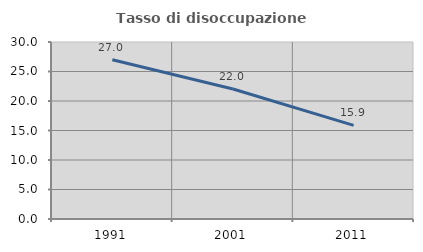
| Category | Tasso di disoccupazione giovanile  |
|---|---|
| 1991.0 | 27 |
| 2001.0 | 22.034 |
| 2011.0 | 15.873 |